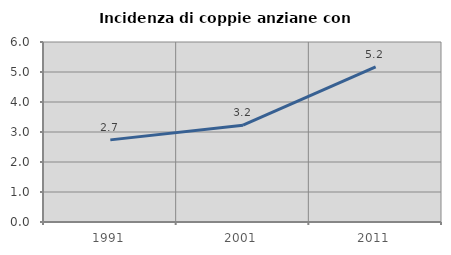
| Category | Incidenza di coppie anziane con figli |
|---|---|
| 1991.0 | 2.738 |
| 2001.0 | 3.229 |
| 2011.0 | 5.17 |